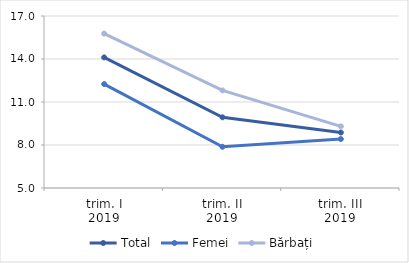
| Category | Total | Femei | Bărbați |
|---|---|---|---|
| trim. I
2019 | 14.113 | 12.25 | 15.775 |
| trim. II
2019 | 9.932 | 7.876 | 11.811 |
| trim. III
2019 | 8.87 | 8.414 | 9.302 |